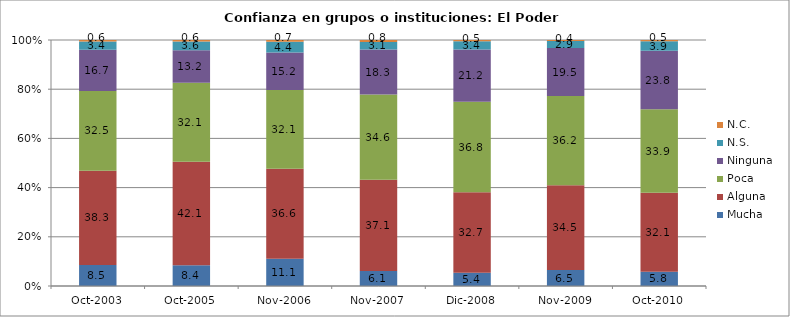
| Category | Mucha | Alguna | Poca | Ninguna | N.S. | N.C. |
|---|---|---|---|---|---|---|
| Oct-2003 | 8.5 | 38.3 | 32.5 | 16.7 | 3.4 | 0.6 |
| Oct-2005 | 8.4 | 42.1 | 32.1 | 13.2 | 3.6 | 0.6 |
| Nov-2006 | 11.1 | 36.6 | 32.1 | 15.2 | 4.4 | 0.7 |
| Nov-2007 | 6.1 | 37.1 | 34.6 | 18.3 | 3.1 | 0.8 |
| Dic-2008 | 5.4 | 32.7 | 36.8 | 21.2 | 3.4 | 0.5 |
| Nov-2009 | 6.5 | 34.5 | 36.2 | 19.5 | 2.9 | 0.4 |
| Oct-2010 | 5.8 | 32.1 | 33.9 | 23.8 | 3.9 | 0.5 |